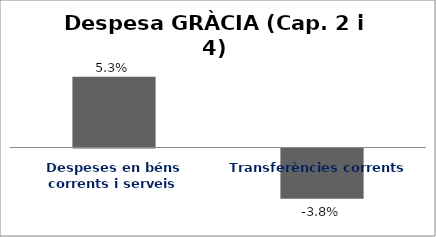
| Category | Series 0 |
|---|---|
| Despeses en béns corrents i serveis | 0.053 |
| Transferències corrents | -0.038 |